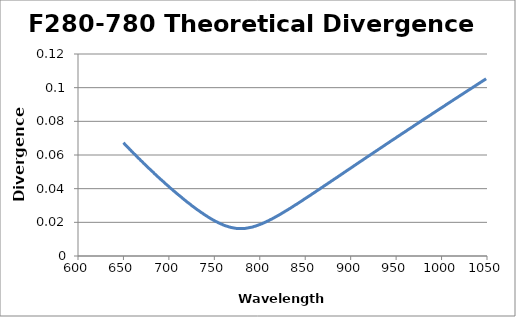
| Category | Divergence (deg) |
|---|---|
| 650.0 | 0.067 |
| 651.0 | 0.067 |
| 652.0 | 0.066 |
| 653.0 | 0.066 |
| 654.0 | 0.065 |
| 655.0 | 0.064 |
| 656.0 | 0.064 |
| 657.0 | 0.063 |
| 658.0 | 0.063 |
| 659.0 | 0.062 |
| 660.0 | 0.062 |
| 661.0 | 0.061 |
| 662.0 | 0.061 |
| 663.0 | 0.06 |
| 664.0 | 0.06 |
| 665.0 | 0.059 |
| 666.0 | 0.058 |
| 667.0 | 0.058 |
| 668.0 | 0.057 |
| 669.0 | 0.057 |
| 670.0 | 0.056 |
| 671.0 | 0.056 |
| 672.0 | 0.055 |
| 673.0 | 0.055 |
| 674.0 | 0.054 |
| 675.0 | 0.054 |
| 676.0 | 0.053 |
| 677.0 | 0.053 |
| 678.0 | 0.052 |
| 679.0 | 0.052 |
| 680.0 | 0.051 |
| 681.0 | 0.051 |
| 682.0 | 0.05 |
| 683.0 | 0.05 |
| 684.0 | 0.049 |
| 685.0 | 0.048 |
| 686.0 | 0.048 |
| 687.0 | 0.048 |
| 688.0 | 0.047 |
| 689.0 | 0.046 |
| 690.0 | 0.046 |
| 691.0 | 0.046 |
| 692.0 | 0.045 |
| 693.0 | 0.045 |
| 694.0 | 0.044 |
| 695.0 | 0.044 |
| 696.0 | 0.043 |
| 697.0 | 0.043 |
| 698.0 | 0.042 |
| 699.0 | 0.042 |
| 700.0 | 0.041 |
| 701.0 | 0.041 |
| 702.0 | 0.04 |
| 703.0 | 0.04 |
| 704.0 | 0.039 |
| 705.0 | 0.039 |
| 706.0 | 0.038 |
| 707.0 | 0.038 |
| 708.0 | 0.038 |
| 709.0 | 0.037 |
| 710.0 | 0.037 |
| 711.0 | 0.036 |
| 712.0 | 0.036 |
| 713.0 | 0.035 |
| 714.0 | 0.035 |
| 715.0 | 0.034 |
| 716.0 | 0.034 |
| 717.0 | 0.033 |
| 718.0 | 0.033 |
| 719.0 | 0.033 |
| 720.0 | 0.032 |
| 721.0 | 0.032 |
| 722.0 | 0.031 |
| 723.0 | 0.031 |
| 724.0 | 0.03 |
| 725.0 | 0.03 |
| 726.0 | 0.03 |
| 727.0 | 0.029 |
| 728.0 | 0.029 |
| 729.0 | 0.028 |
| 730.0 | 0.028 |
| 731.0 | 0.028 |
| 732.0 | 0.027 |
| 733.0 | 0.027 |
| 734.0 | 0.026 |
| 735.0 | 0.026 |
| 736.0 | 0.026 |
| 737.0 | 0.025 |
| 738.0 | 0.025 |
| 739.0 | 0.025 |
| 740.0 | 0.024 |
| 741.0 | 0.024 |
| 742.0 | 0.024 |
| 743.0 | 0.023 |
| 744.0 | 0.023 |
| 745.0 | 0.023 |
| 746.0 | 0.022 |
| 747.0 | 0.022 |
| 748.0 | 0.022 |
| 749.0 | 0.021 |
| 750.0 | 0.021 |
| 751.0 | 0.021 |
| 752.0 | 0.02 |
| 753.0 | 0.02 |
| 754.0 | 0.02 |
| 755.0 | 0.02 |
| 756.0 | 0.019 |
| 757.0 | 0.019 |
| 758.0 | 0.019 |
| 759.0 | 0.019 |
| 760.0 | 0.018 |
| 761.0 | 0.018 |
| 762.0 | 0.018 |
| 763.0 | 0.018 |
| 764.0 | 0.018 |
| 765.0 | 0.018 |
| 766.0 | 0.017 |
| 767.0 | 0.017 |
| 768.0 | 0.017 |
| 769.0 | 0.017 |
| 770.0 | 0.017 |
| 771.0 | 0.017 |
| 772.0 | 0.017 |
| 773.0 | 0.016 |
| 774.0 | 0.016 |
| 775.0 | 0.016 |
| 776.0 | 0.016 |
| 777.0 | 0.016 |
| 778.0 | 0.016 |
| 779.0 | 0.016 |
| 780.0 | 0.016 |
| 781.0 | 0.016 |
| 782.0 | 0.016 |
| 783.0 | 0.016 |
| 784.0 | 0.016 |
| 785.0 | 0.016 |
| 786.0 | 0.017 |
| 787.0 | 0.017 |
| 788.0 | 0.017 |
| 789.0 | 0.017 |
| 790.0 | 0.017 |
| 791.0 | 0.017 |
| 792.0 | 0.017 |
| 793.0 | 0.017 |
| 794.0 | 0.018 |
| 795.0 | 0.018 |
| 796.0 | 0.018 |
| 797.0 | 0.018 |
| 798.0 | 0.018 |
| 799.0 | 0.018 |
| 800.0 | 0.019 |
| 801.0 | 0.019 |
| 802.0 | 0.019 |
| 803.0 | 0.019 |
| 804.0 | 0.02 |
| 805.0 | 0.02 |
| 806.0 | 0.02 |
| 807.0 | 0.02 |
| 808.0 | 0.021 |
| 809.0 | 0.021 |
| 810.0 | 0.021 |
| 811.0 | 0.021 |
| 812.0 | 0.022 |
| 813.0 | 0.022 |
| 814.0 | 0.022 |
| 815.0 | 0.022 |
| 816.0 | 0.023 |
| 817.0 | 0.023 |
| 818.0 | 0.023 |
| 819.0 | 0.024 |
| 820.0 | 0.024 |
| 821.0 | 0.024 |
| 822.0 | 0.025 |
| 823.0 | 0.025 |
| 824.0 | 0.025 |
| 825.0 | 0.026 |
| 826.0 | 0.026 |
| 827.0 | 0.026 |
| 828.0 | 0.027 |
| 829.0 | 0.027 |
| 830.0 | 0.027 |
| 831.0 | 0.028 |
| 832.0 | 0.028 |
| 833.0 | 0.028 |
| 834.0 | 0.028 |
| 835.0 | 0.029 |
| 836.0 | 0.029 |
| 837.0 | 0.03 |
| 838.0 | 0.03 |
| 839.0 | 0.03 |
| 840.0 | 0.031 |
| 841.0 | 0.031 |
| 842.0 | 0.031 |
| 843.0 | 0.032 |
| 844.0 | 0.032 |
| 845.0 | 0.032 |
| 846.0 | 0.033 |
| 847.0 | 0.033 |
| 848.0 | 0.033 |
| 849.0 | 0.034 |
| 850.0 | 0.034 |
| 851.0 | 0.034 |
| 852.0 | 0.035 |
| 853.0 | 0.035 |
| 854.0 | 0.036 |
| 855.0 | 0.036 |
| 856.0 | 0.036 |
| 857.0 | 0.037 |
| 858.0 | 0.037 |
| 859.0 | 0.037 |
| 860.0 | 0.038 |
| 861.0 | 0.038 |
| 862.0 | 0.038 |
| 863.0 | 0.039 |
| 864.0 | 0.039 |
| 865.0 | 0.04 |
| 866.0 | 0.04 |
| 867.0 | 0.04 |
| 868.0 | 0.041 |
| 869.0 | 0.041 |
| 870.0 | 0.041 |
| 871.0 | 0.042 |
| 872.0 | 0.042 |
| 873.0 | 0.042 |
| 874.0 | 0.043 |
| 875.0 | 0.043 |
| 876.0 | 0.044 |
| 877.0 | 0.044 |
| 878.0 | 0.044 |
| 879.0 | 0.045 |
| 880.0 | 0.045 |
| 881.0 | 0.045 |
| 882.0 | 0.046 |
| 883.0 | 0.046 |
| 884.0 | 0.046 |
| 885.0 | 0.047 |
| 886.0 | 0.047 |
| 887.0 | 0.048 |
| 888.0 | 0.048 |
| 889.0 | 0.048 |
| 890.0 | 0.049 |
| 891.0 | 0.049 |
| 892.0 | 0.049 |
| 893.0 | 0.05 |
| 894.0 | 0.05 |
| 895.0 | 0.05 |
| 896.0 | 0.051 |
| 897.0 | 0.051 |
| 898.0 | 0.052 |
| 899.0 | 0.052 |
| 900.0 | 0.052 |
| 901.0 | 0.053 |
| 902.0 | 0.053 |
| 903.0 | 0.053 |
| 904.0 | 0.054 |
| 905.0 | 0.054 |
| 906.0 | 0.054 |
| 907.0 | 0.055 |
| 908.0 | 0.055 |
| 909.0 | 0.056 |
| 910.0 | 0.056 |
| 911.0 | 0.056 |
| 912.0 | 0.057 |
| 913.0 | 0.057 |
| 914.0 | 0.057 |
| 915.0 | 0.058 |
| 916.0 | 0.058 |
| 917.0 | 0.058 |
| 918.0 | 0.059 |
| 919.0 | 0.059 |
| 920.0 | 0.06 |
| 921.0 | 0.06 |
| 922.0 | 0.06 |
| 923.0 | 0.061 |
| 924.0 | 0.061 |
| 925.0 | 0.061 |
| 926.0 | 0.062 |
| 927.0 | 0.062 |
| 928.0 | 0.062 |
| 929.0 | 0.063 |
| 930.0 | 0.063 |
| 931.0 | 0.064 |
| 932.0 | 0.064 |
| 933.0 | 0.064 |
| 934.0 | 0.064 |
| 935.0 | 0.065 |
| 936.0 | 0.065 |
| 937.0 | 0.066 |
| 938.0 | 0.066 |
| 939.0 | 0.066 |
| 940.0 | 0.067 |
| 941.0 | 0.067 |
| 942.0 | 0.067 |
| 943.0 | 0.068 |
| 944.0 | 0.068 |
| 945.0 | 0.068 |
| 946.0 | 0.069 |
| 947.0 | 0.069 |
| 948.0 | 0.07 |
| 949.0 | 0.07 |
| 950.0 | 0.07 |
| 951.0 | 0.071 |
| 952.0 | 0.071 |
| 953.0 | 0.071 |
| 954.0 | 0.072 |
| 955.0 | 0.072 |
| 956.0 | 0.072 |
| 957.0 | 0.073 |
| 958.0 | 0.073 |
| 959.0 | 0.074 |
| 960.0 | 0.074 |
| 961.0 | 0.074 |
| 962.0 | 0.075 |
| 963.0 | 0.075 |
| 964.0 | 0.075 |
| 965.0 | 0.076 |
| 966.0 | 0.076 |
| 967.0 | 0.076 |
| 968.0 | 0.077 |
| 969.0 | 0.077 |
| 970.0 | 0.078 |
| 971.0 | 0.078 |
| 972.0 | 0.078 |
| 973.0 | 0.078 |
| 974.0 | 0.079 |
| 975.0 | 0.079 |
| 976.0 | 0.08 |
| 977.0 | 0.08 |
| 978.0 | 0.08 |
| 979.0 | 0.081 |
| 980.0 | 0.081 |
| 981.0 | 0.081 |
| 982.0 | 0.082 |
| 983.0 | 0.082 |
| 984.0 | 0.082 |
| 985.0 | 0.083 |
| 986.0 | 0.083 |
| 987.0 | 0.084 |
| 988.0 | 0.084 |
| 989.0 | 0.084 |
| 990.0 | 0.085 |
| 991.0 | 0.085 |
| 992.0 | 0.085 |
| 993.0 | 0.086 |
| 994.0 | 0.086 |
| 995.0 | 0.086 |
| 996.0 | 0.087 |
| 997.0 | 0.087 |
| 998.0 | 0.087 |
| 999.0 | 0.088 |
| 1000.0 | 0.088 |
| 1001.0 | 0.088 |
| 1002.0 | 0.089 |
| 1003.0 | 0.089 |
| 1004.0 | 0.09 |
| 1005.0 | 0.09 |
| 1006.0 | 0.09 |
| 1007.0 | 0.091 |
| 1008.0 | 0.091 |
| 1009.0 | 0.091 |
| 1010.0 | 0.092 |
| 1011.0 | 0.092 |
| 1012.0 | 0.092 |
| 1013.0 | 0.093 |
| 1014.0 | 0.093 |
| 1015.0 | 0.093 |
| 1016.0 | 0.094 |
| 1017.0 | 0.094 |
| 1018.0 | 0.094 |
| 1019.0 | 0.095 |
| 1020.0 | 0.095 |
| 1021.0 | 0.096 |
| 1022.0 | 0.096 |
| 1023.0 | 0.096 |
| 1024.0 | 0.096 |
| 1025.0 | 0.097 |
| 1026.0 | 0.097 |
| 1027.0 | 0.098 |
| 1028.0 | 0.098 |
| 1029.0 | 0.098 |
| 1030.0 | 0.099 |
| 1031.0 | 0.099 |
| 1032.0 | 0.099 |
| 1033.0 | 0.1 |
| 1034.0 | 0.1 |
| 1035.0 | 0.1 |
| 1036.0 | 0.101 |
| 1037.0 | 0.101 |
| 1038.0 | 0.101 |
| 1039.0 | 0.102 |
| 1040.0 | 0.102 |
| 1041.0 | 0.102 |
| 1042.0 | 0.103 |
| 1043.0 | 0.103 |
| 1044.0 | 0.104 |
| 1045.0 | 0.104 |
| 1046.0 | 0.104 |
| 1047.0 | 0.105 |
| 1048.0 | 0.105 |
| 1049.0 | 0.105 |